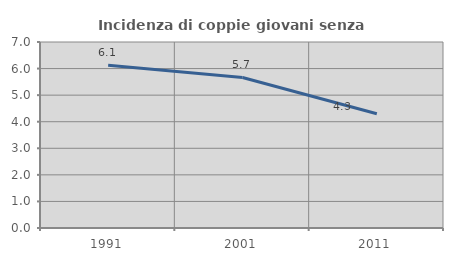
| Category | Incidenza di coppie giovani senza figli |
|---|---|
| 1991.0 | 6.128 |
| 2001.0 | 5.666 |
| 2011.0 | 4.301 |